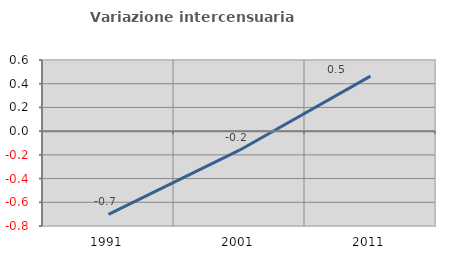
| Category | Variazione intercensuaria annua |
|---|---|
| 1991.0 | -0.702 |
| 2001.0 | -0.161 |
| 2011.0 | 0.464 |